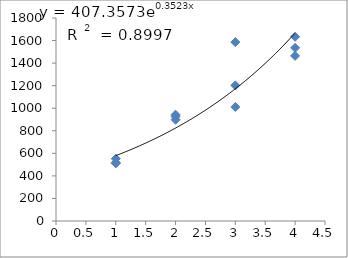
| Category | Series 0 |
|---|---|
| 1.0 | 552.374 |
| 1.0 | 510.685 |
| 1.0 | 518.502 |
| 2.0 | 942.877 |
| 2.0 | 926.14 |
| 2.0 | 898.244 |
| 3.0 | 1202.584 |
| 3.0 | 1011.022 |
| 3.0 | 1585.708 |
| 4.0 | 1464.243 |
| 4.0 | 1633.614 |
| 4.0 | 1535.27 |